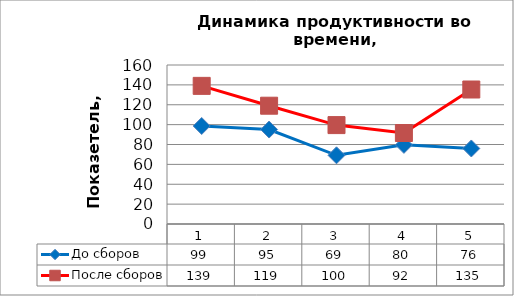
| Category | До сборов | После сборов |
|---|---|---|
| 0 | 98.619 | 139 |
| 1 | 95.059 | 119.04 |
| 2 | 69.143 | 99.524 |
| 3 | 79.625 | 91.56 |
| 4 | 76 | 135.342 |